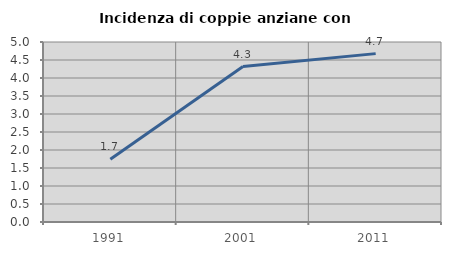
| Category | Incidenza di coppie anziane con figli |
|---|---|
| 1991.0 | 1.742 |
| 2001.0 | 4.317 |
| 2011.0 | 4.677 |